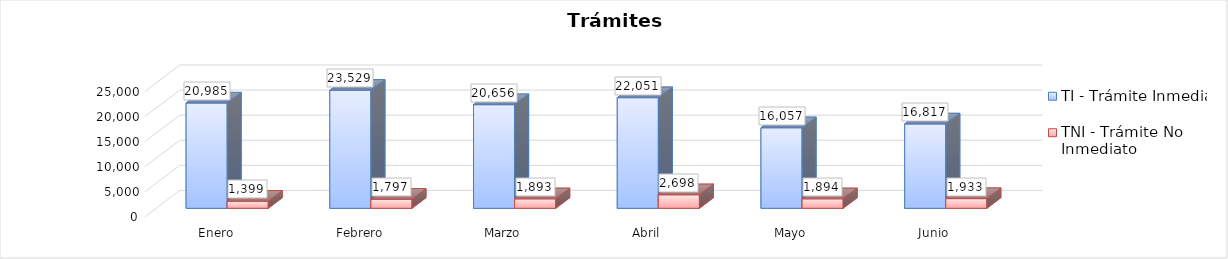
| Category | TI - Trámite Inmediato | TNI - Trámite No Inmediato |
|---|---|---|
| Enero | 20985 | 1399 |
| Febrero | 23529 | 1797 |
| Marzo | 20656 | 1893 |
| Abril | 22051 | 2698 |
| Mayo | 16057 | 1894 |
| Junio | 16817 | 1933 |